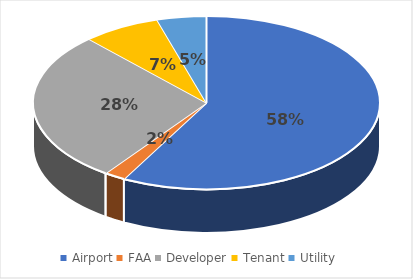
| Category | Series 0 |
|---|---|
| Airport | 88 |
| FAA | 3 |
| Developer | 43 |
| Tenant | 11 |
| Utility | 7 |